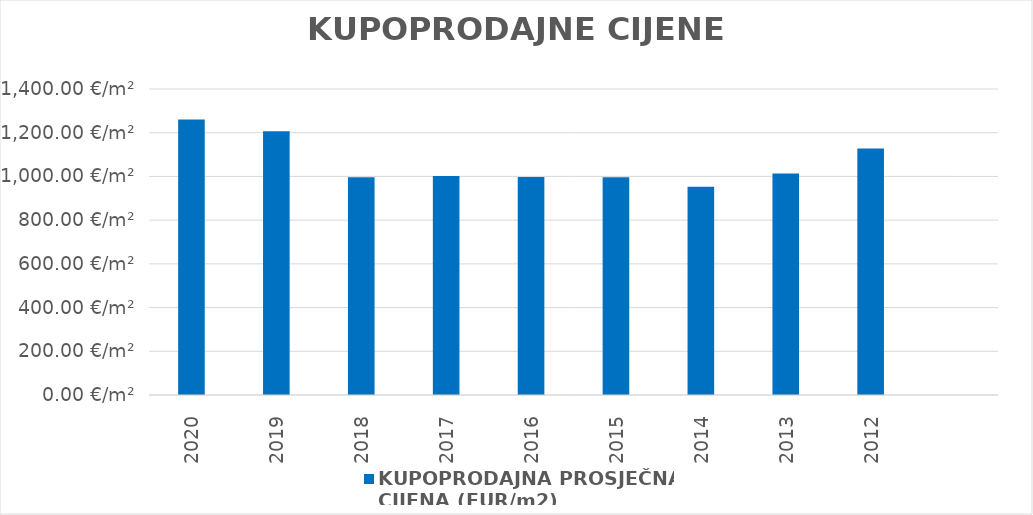
| Category | KUPOPRODAJNA PROSJEČNA 
CIJENA (EUR/m2) |
|---|---|
| 2020 | 1903-06-13 10:47:44 |
| 2019 | 1903-04-20 15:42:48 |
| 2018 | 1902-09-22 02:08:01 |
| 2017 | 1902-09-28 01:16:14 |
| 2016 | 1902-09-23 10:47:42 |
| 2015 | 1902-09-22 02:14:05 |
| 2014 | 1902-08-09 21:04:11 |
| 2013 | 1902-10-08 23:15:54 |
| 2012 | 1903-01-31 05:18:08 |